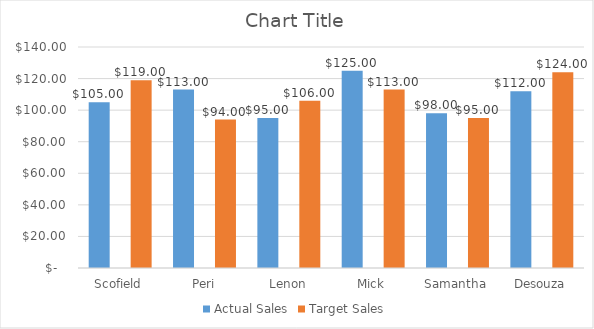
| Category | Actual Sales | Target Sales |
|---|---|---|
| Scofield | 105 | 119 |
| Peri | 113 | 94 |
| Lenon | 95 | 106 |
| Mick | 125 | 113 |
| Samantha | 98 | 95 |
| Desouza | 112 | 124 |